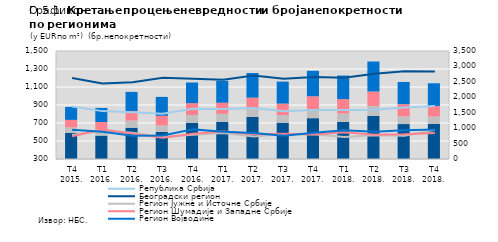
| Category | Београдски регион | Регион Јужне и Источне Србије | Шумадија | Регион Војводине |
|---|---|---|---|---|
| Т4 2015. | 849 | 176 | 243 | 421 |
| Т1 2016. | 758 | 208 | 232 | 457 |
| Т2 2016. | 1013 | 233 | 309 | 620 |
| Т3 2016. | 879 | 207 | 315 | 612 |
| Т4 2016. | 1169 | 254 | 386 | 671 |
| Т1 2017. | 1201 | 262 | 361 | 710 |
| Т2 2017. | 1363 | 253 | 372 | 799 |
| Т3 2017. | 1176 | 249 | 371 | 713 |
| Т4 2017. | 1323 | 295 | 415 | 825 |
| Т1 2018. | 1204 | 268 | 468 | 764 |
| Т2 2018. | 1393 | 326 | 468 | 973 |
| Т3 2018. | 1132 | 249 | 396 | 720 |
| Т4 2018. | 1140 | 238 | 341 | 735 |